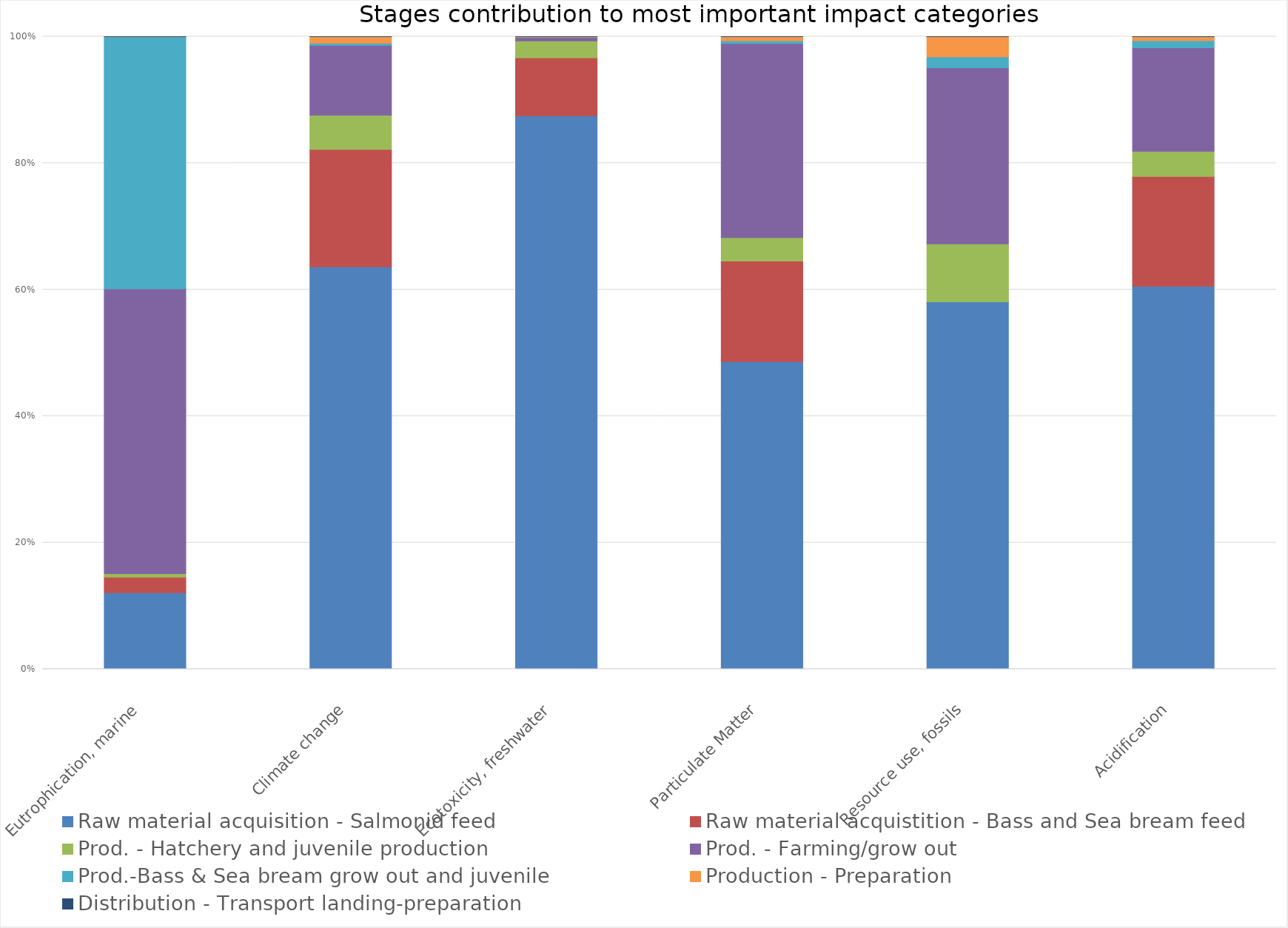
| Category | Raw material acquisition - Salmonid feed | Raw material acquistition - Bass and Sea bream feed | Prod. - Hatchery and juvenile production | Prod. - Farming/grow out | Prod.-Bass & Sea bream grow out and juvenile | Production - Preparation | Distribution - Transport landing-preparation |
|---|---|---|---|---|---|---|---|
| Eutrophication, marine | 0.121 | 0.025 | 0.006 | 0.45 | 0.398 | 0 | 0 |
| Climate change | 0.588 | 0.172 | 0.05 | 0.102 | 0.003 | 0.009 | 0 |
| Ecotoxicity, freshwater | 0.874 | 0.092 | 0.026 | 0.006 | 0 | 0.001 | 0 |
| Particulate Matter | 0.473 | 0.155 | 0.036 | 0.299 | 0.004 | 0.006 | 0 |
| Resource use, fossils | 0.471 | 0 | 0.074 | 0.226 | 0.014 | 0.026 | 0 |
| Acidification | 0.583 | 0.167 | 0.038 | 0.158 | 0.011 | 0.006 | 0 |